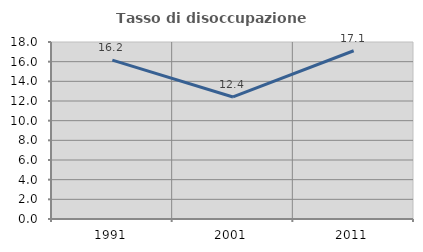
| Category | Tasso di disoccupazione giovanile  |
|---|---|
| 1991.0 | 16.154 |
| 2001.0 | 12.411 |
| 2011.0 | 17.112 |